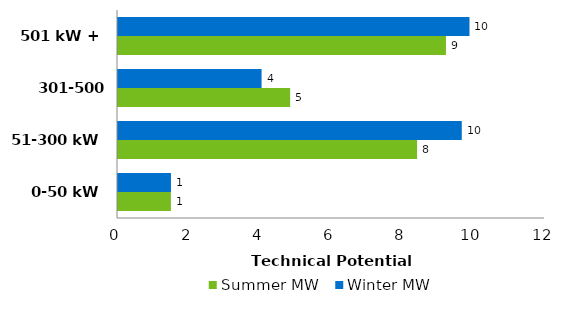
| Category | Summer MW | Winter MW |
|---|---|---|
| 0-50 kW | 1.487 | 1.488 |
| 51-300 kW | 8.405 | 9.661 |
| 301-500 kW | 4.838 | 4.035 |
| 501 kW + | 9.217 | 9.878 |